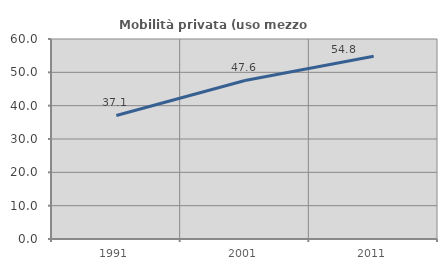
| Category | Mobilità privata (uso mezzo privato) |
|---|---|
| 1991.0 | 37.055 |
| 2001.0 | 47.563 |
| 2011.0 | 54.804 |